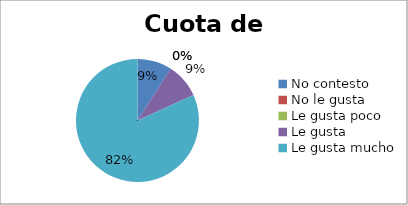
| Category | Series 0 |
|---|---|
| No contesto | 1 |
| No le gusta | 0 |
| Le gusta poco | 0 |
| Le gusta | 1 |
| Le gusta mucho | 9 |